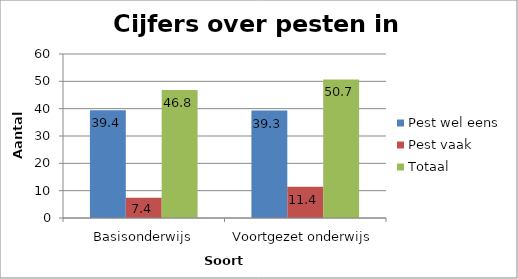
| Category | Pest wel eens | Pest vaak | Totaal |
|---|---|---|---|
| Basisonderwijs | 39.4 | 7.4 | 46.8 |
| Voortgezet onderwijs | 39.3 | 11.4 | 50.7 |